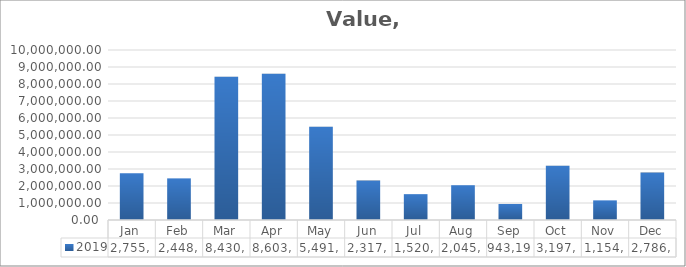
| Category | 2019 |
|---|---|
| Jan | 2755800.983 |
| Feb | 2448602.277 |
| Mar | 8430952.486 |
| Apr | 8603224.126 |
| May | 5491608.58 |
| Jun | 2317742.02 |
| Jul | 1520433.963 |
| Aug | 2045943.325 |
| Sep | 943194.899 |
| Oct | 3197349.537 |
| Nov | 1154656.65 |
| Dec | 2786779.077 |